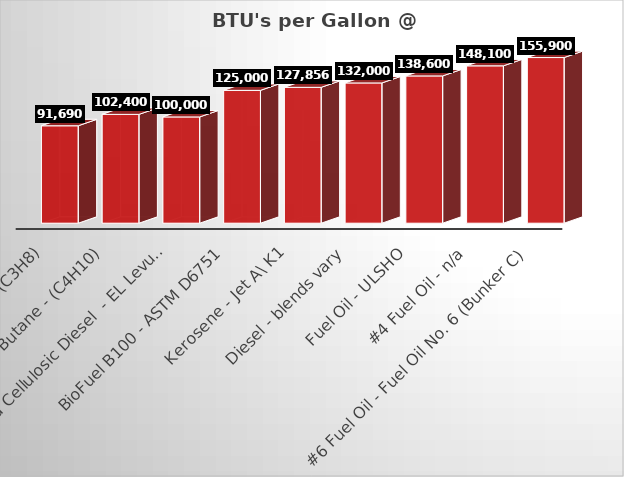
| Category | BTU's per Gallon @ 60°F |
|---|---|
| Propane - HD5 (C3H8) | 91690 |
| Butane - (C4H10) | 102400 |
| Advanced Cellulosic Diesel  - EL Levulinic Ester Blends | 100000 |
| BioFuel B100 - ASTM D6751 | 125000 |
| Kerosene - Jet A\ K1 | 127856 |
| Diesel - blends vary | 132000 |
| Fuel Oil - ULSHO | 138600 |
| #4 Fuel Oil - n/a | 148100 |
| #6 Fuel Oil - Fuel Oil No. 6 (Bunker C) | 155900 |